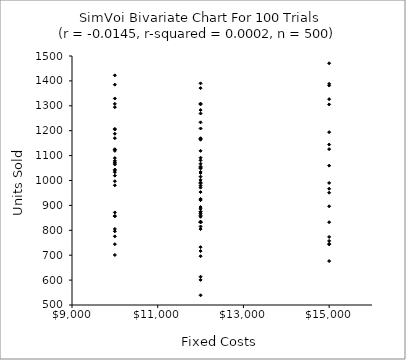
| Category | Series 0 |
|---|---|
| 12000.0 | 854.23 |
| 12000.0 | 1169.861 |
| 12000.0 | 1371.011 |
| 10000.0 | 1079.31 |
| 12000.0 | 1282.814 |
| 15000.0 | 1059.682 |
| 10000.0 | 1124.521 |
| 10000.0 | 1422.244 |
| 10000.0 | 805.429 |
| 12000.0 | 834.728 |
| 12000.0 | 1163.925 |
| 12000.0 | 953.472 |
| 12000.0 | 1002.386 |
| 15000.0 | 832.467 |
| 12000.0 | 971.409 |
| 15000.0 | 676.319 |
| 10000.0 | 700.836 |
| 12000.0 | 992.286 |
| 12000.0 | 1208.853 |
| 15000.0 | 757.344 |
| 12000.0 | 1015.661 |
| 10000.0 | 1125.615 |
| 10000.0 | 1069.892 |
| 12000.0 | 832.478 |
| 15000.0 | 743.458 |
| 12000.0 | 926.007 |
| 12000.0 | 832.652 |
| 12000.0 | 1048.438 |
| 12000.0 | 1030.204 |
| 12000.0 | 1269.046 |
| 10000.0 | 1207.338 |
| 12000.0 | 1167.42 |
| 10000.0 | 1307.757 |
| 15000.0 | 1125.903 |
| 15000.0 | 1144.347 |
| 10000.0 | 1038.957 |
| 12000.0 | 600.88 |
| 12000.0 | 874.603 |
| 12000.0 | 804.831 |
| 12000.0 | 732.243 |
| 15000.0 | 990.234 |
| 12000.0 | 867.098 |
| 15000.0 | 1470.634 |
| 12000.0 | 1233.588 |
| 12000.0 | 696.022 |
| 12000.0 | 922.416 |
| 10000.0 | 1294.505 |
| 12000.0 | 1119.146 |
| 10000.0 | 871.681 |
| 12000.0 | 538.991 |
| 10000.0 | 1090.006 |
| 15000.0 | 1381.438 |
| 12000.0 | 1034.427 |
| 12000.0 | 886.151 |
| 15000.0 | 951.063 |
| 10000.0 | 997.18 |
| 12000.0 | 613.551 |
| 12000.0 | 893.324 |
| 12000.0 | 979.211 |
| 10000.0 | 1187.695 |
| 15000.0 | 745.333 |
| 10000.0 | 1033.237 |
| 15000.0 | 966.919 |
| 10000.0 | 1204.847 |
| 12000.0 | 1308.863 |
| 15000.0 | 1388.137 |
| 12000.0 | 831.999 |
| 15000.0 | 773.353 |
| 10000.0 | 1119.056 |
| 15000.0 | 896.287 |
| 10000.0 | 980.61 |
| 10000.0 | 775.631 |
| 10000.0 | 744.272 |
| 10000.0 | 1329.331 |
| 12000.0 | 988.214 |
| 10000.0 | 1043.899 |
| 12000.0 | 815.304 |
| 10000.0 | 1073.694 |
| 12000.0 | 859.874 |
| 12000.0 | 1051.392 |
| 15000.0 | 1305.487 |
| 10000.0 | 856.355 |
| 12000.0 | 716.742 |
| 10000.0 | 1019.464 |
| 15000.0 | 1326.685 |
| 12000.0 | 1390.113 |
| 12000.0 | 921.232 |
| 12000.0 | 1091.644 |
| 12000.0 | 1080.904 |
| 10000.0 | 795.877 |
| 10000.0 | 1385.003 |
| 12000.0 | 1305.711 |
| 10000.0 | 857.593 |
| 12000.0 | 873.941 |
| 15000.0 | 1194.191 |
| 12000.0 | 1067.496 |
| 10000.0 | 1170.08 |
| 12000.0 | 873.683 |
| 12000.0 | 1056.209 |
| 10000.0 | 1064.546 |